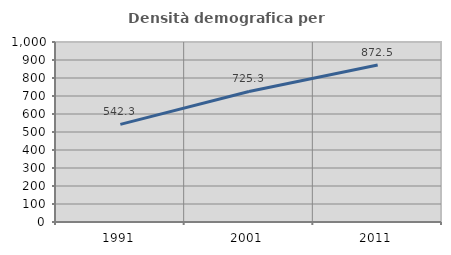
| Category | Densità demografica |
|---|---|
| 1991.0 | 542.314 |
| 2001.0 | 725.258 |
| 2011.0 | 872.461 |